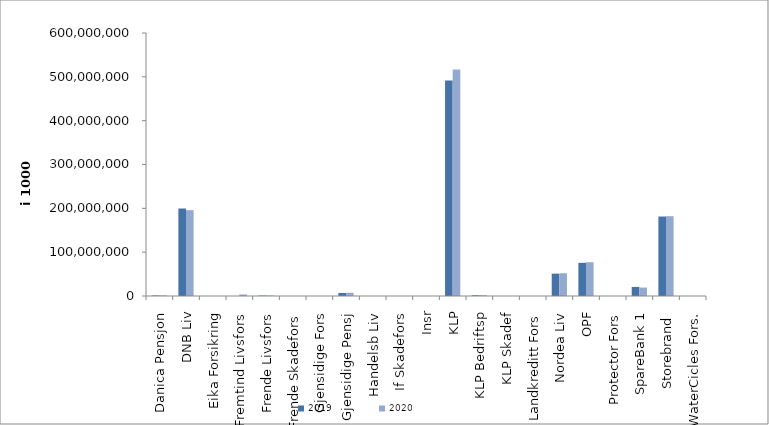
| Category | 2019 | 2020 |
|---|---|---|
| Danica Pensjon | 1199454.547 | 1259550.713 |
| DNB Liv | 199601126.129 | 195862400 |
| Eika Forsikring | 0 | 0 |
| Fremtind Livsfors | 0 | 3587824.385 |
| Frende Livsfors | 1044889 | 1132352 |
| Frende Skadefors | 0 | 0 |
| Gjensidige Fors | 0 | 0 |
| Gjensidige Pensj | 6946187 | 7375058.8 |
| Handelsb Liv | 16959.646 | 24707.773 |
| If Skadefors | 0 | 0 |
| Insr | 2349.147 | 0 |
| KLP | 491892859.819 | 516931786.696 |
| KLP Bedriftsp | 1731438 | 1786281 |
| KLP Skadef | 30106 | 45976.865 |
| Landkreditt Fors | 0 | 0 |
| Nordea Liv | 51019702 | 51856098.771 |
| OPF | 75627238.393 | 77112000 |
| Protector Fors | 0 | 0 |
| SpareBank 1 | 20684132.106 | 19251355.336 |
| Storebrand  | 181337324.649 | 182079379.465 |
| WaterCicles Fors. | 0 | 0 |